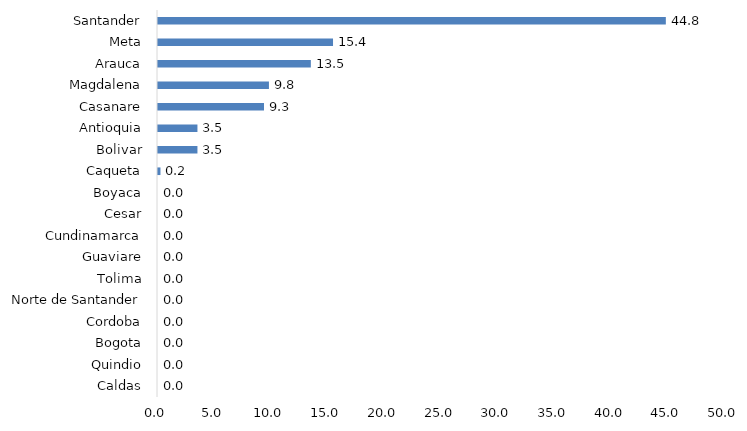
| Category | Series 0 |
|---|---|
| Caldas | 0 |
| Quindio | 0 |
| Bogota | 0 |
| Cordoba | 0 |
| Norte de Santander | 0 |
| Tolima | 0 |
| Guaviare | 0 |
| Cundinamarca | 0 |
| Cesar | 0 |
| Boyaca | 0 |
| Caqueta | 0.217 |
| Bolivar | 3.478 |
| Antioquia | 3.478 |
| Casanare | 9.348 |
| Magdalena | 9.783 |
| Arauca | 13.478 |
| Meta | 15.435 |
| Santander | 44.783 |